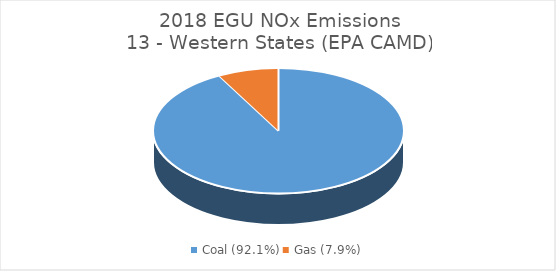
| Category | NOx |
|---|---|
| Coal (92.1%) | 181975.611 |
| Gas (7.9%) | 15530.343 |